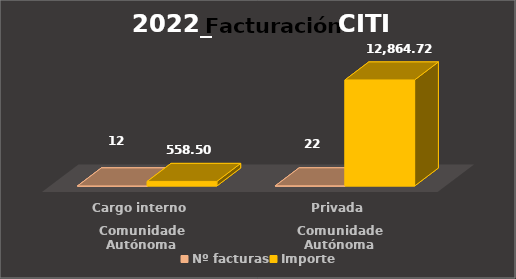
| Category | Nº facturas | Importe |
|---|---|---|
| 0 | 12 | 558.5 |
| 1 | 22 | 12864.72 |